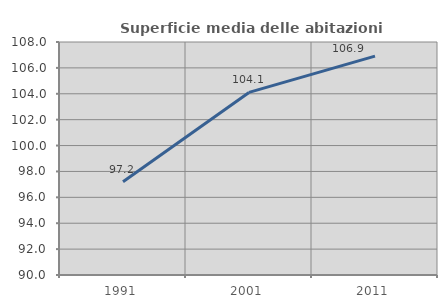
| Category | Superficie media delle abitazioni occupate |
|---|---|
| 1991.0 | 97.2 |
| 2001.0 | 104.104 |
| 2011.0 | 106.905 |